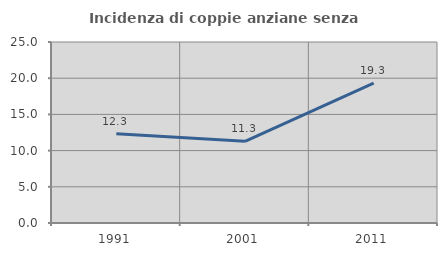
| Category | Incidenza di coppie anziane senza figli  |
|---|---|
| 1991.0 | 12.319 |
| 2001.0 | 11.278 |
| 2011.0 | 19.31 |